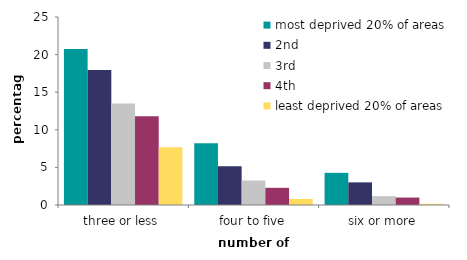
| Category | most deprived 20% of areas | 2nd | 3rd | 4th | least deprived 20% of areas |
|---|---|---|---|---|---|
| three or less | 20.745 | 17.95 | 13.501 | 11.804 | 7.664 |
| four to five | 8.21 | 5.143 | 3.254 | 2.283 | 0.802 |
| six or more | 4.275 | 3.009 | 1.175 | 0.991 | 0.15 |